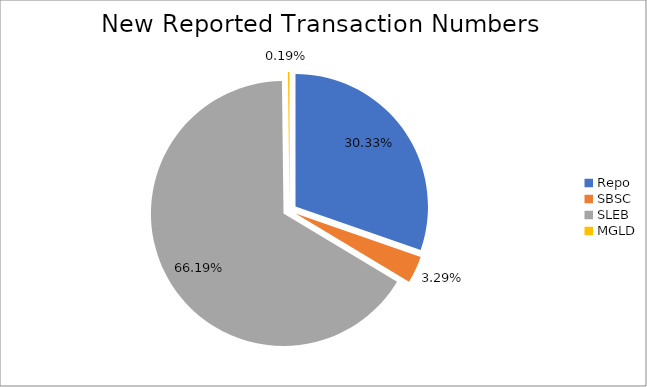
| Category | Series 0 |
|---|---|
| Repo | 425749 |
| SBSC | 46177 |
| SLEB | 929167 |
| MGLD | 2657 |